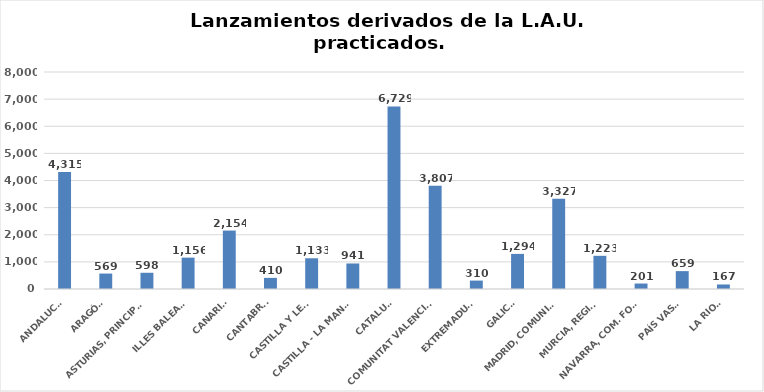
| Category | Series 0 |
|---|---|
| ANDALUCÍA | 4315 |
| ARAGÓN | 569 |
| ASTURIAS, PRINCIPADO | 598 |
| ILLES BALEARS | 1156 |
| CANARIAS | 2154 |
| CANTABRIA | 410 |
| CASTILLA Y LEÓN | 1133 |
| CASTILLA - LA MANCHA | 941 |
| CATALUÑA | 6729 |
| COMUNITAT VALENCIANA | 3807 |
| EXTREMADURA | 310 |
| GALICIA | 1294 |
| MADRID, COMUNIDAD | 3327 |
| MURCIA, REGIÓN | 1223 |
| NAVARRA, COM. FORAL | 201 |
| PAÍS VASCO | 659 |
| LA RIOJA | 167 |